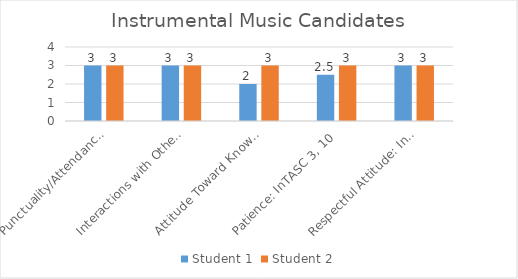
| Category | Student 1 | Student 2 |
|---|---|---|
| Punctuality/Attendance: InTASC 1, 9 | 3 | 3 |
| Interactions with Others: InTASC 3, 7, 10 | 3 | 3 |
| Attitude Toward Knowledge and Learning: InTASC 1, 4, 5, 9, 10 | 2 | 3 |
| Patience: InTASC 3, 10 | 2.5 | 3 |
| Respectful Attitude: InTASC 3, 7, 10 | 3 | 3 |